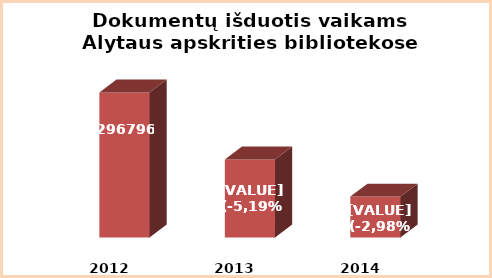
| Category | Series 0 |
|---|---|
| 2012.0 | 296796 |
| 2013.0 | 282137 |
| 2014.0 | 273968 |